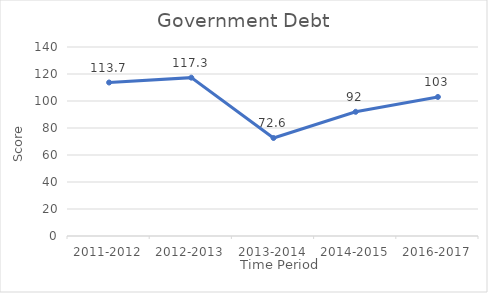
| Category | Series 0 |
|---|---|
| 2011-2012 | 113.7 |
| 2012-2013 | 117.3 |
| 2013-2014 | 72.6 |
| 2014-2015 | 92 |
| 2016-2017 | 103 |